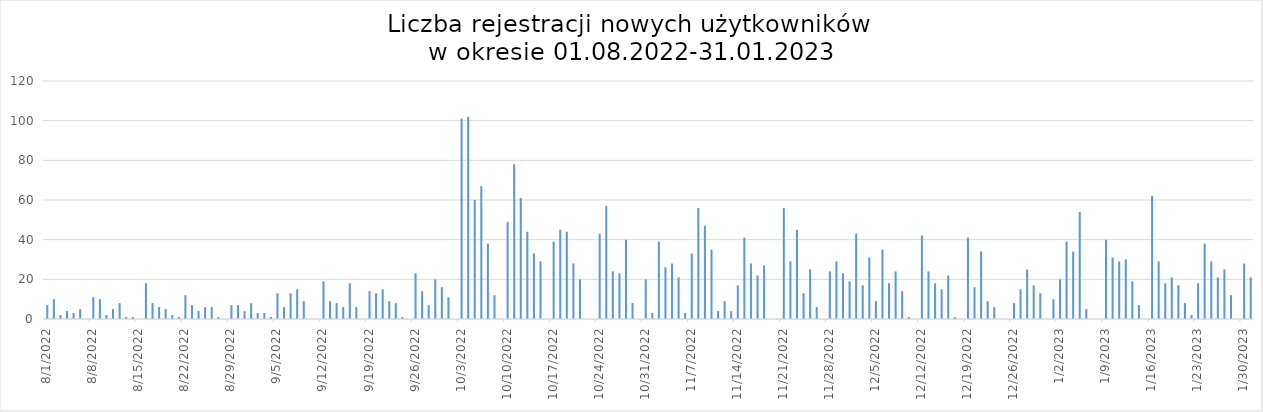
| Category | Dzienna liczba rejestracji |
|---|---|
| 8/1/22 | 7 |
| 8/2/22 | 10 |
| 8/3/22 | 2 |
| 8/4/22 | 4 |
| 8/5/22 | 3 |
| 8/6/22 | 5 |
| 8/8/22 | 11 |
| 8/9/22 | 10 |
| 8/10/22 | 2 |
| 8/11/22 | 5 |
| 8/12/22 | 8 |
| 8/13/22 | 1 |
| 8/14/22 | 1 |
| 8/16/22 | 18 |
| 8/17/22 | 8 |
| 8/18/22 | 6 |
| 8/19/22 | 5 |
| 8/20/22 | 2 |
| 8/21/22 | 1 |
| 8/22/22 | 12 |
| 8/23/22 | 7 |
| 8/24/22 | 4 |
| 8/25/22 | 6 |
| 8/26/22 | 6 |
| 8/27/22 | 1 |
| 8/29/22 | 7 |
| 8/30/22 | 7 |
| 8/31/22 | 4 |
| 9/1/22 | 8 |
| 9/2/22 | 3 |
| 9/3/22 | 3 |
| 9/4/22 | 1 |
| 9/5/22 | 13 |
| 9/6/22 | 6 |
| 9/7/22 | 13 |
| 9/8/22 | 15 |
| 9/9/22 | 9 |
| 9/12/22 | 19 |
| 9/13/22 | 9 |
| 9/14/22 | 8 |
| 9/15/22 | 6 |
| 9/16/22 | 18 |
| 9/17/22 | 6 |
| 9/19/22 | 14 |
| 9/20/22 | 13 |
| 9/21/22 | 15 |
| 9/22/22 | 9 |
| 9/23/22 | 8 |
| 9/24/22 | 1 |
| 9/26/22 | 23 |
| 9/27/22 | 14 |
| 9/28/22 | 7 |
| 9/29/22 | 20 |
| 9/30/22 | 16 |
| 10/1/22 | 11 |
| 10/3/22 | 101 |
| 10/4/22 | 102 |
| 10/5/22 | 60 |
| 10/6/22 | 67 |
| 10/7/22 | 38 |
| 10/8/22 | 12 |
| 10/10/22 | 49 |
| 10/11/22 | 78 |
| 10/12/22 | 61 |
| 10/13/22 | 44 |
| 10/14/22 | 33 |
| 10/15/22 | 29 |
| 10/17/22 | 39 |
| 10/18/22 | 45 |
| 10/19/22 | 44 |
| 10/20/22 | 28 |
| 10/21/22 | 20 |
| 10/24/22 | 43 |
| 10/25/22 | 57 |
| 10/26/22 | 24 |
| 10/27/22 | 23 |
| 10/28/22 | 40 |
| 10/29/22 | 8 |
| 10/31/22 | 20 |
| 11/1/22 | 3 |
| 11/2/22 | 39 |
| 11/3/22 | 26 |
| 11/4/22 | 28 |
| 11/5/22 | 21 |
| 11/6/22 | 3 |
| 11/7/22 | 33 |
| 11/8/22 | 56 |
| 11/9/22 | 47 |
| 11/10/22 | 35 |
| 11/11/22 | 4 |
| 11/12/22 | 9 |
| 11/13/22 | 4 |
| 11/14/22 | 17 |
| 11/15/22 | 41 |
| 11/16/22 | 28 |
| 11/17/22 | 22 |
| 11/18/22 | 27 |
| 11/21/22 | 56 |
| 11/22/22 | 29 |
| 11/23/22 | 45 |
| 11/24/22 | 13 |
| 11/25/22 | 25 |
| 11/26/22 | 6 |
| 11/28/22 | 24 |
| 11/29/22 | 29 |
| 11/30/22 | 23 |
| 12/1/22 | 19 |
| 12/2/22 | 43 |
| 12/3/22 | 17 |
| 12/4/22 | 31 |
| 12/5/22 | 9 |
| 12/6/22 | 35 |
| 12/7/22 | 18 |
| 12/8/22 | 24 |
| 12/9/22 | 14 |
| 12/10/22 | 1 |
| 12/12/22 | 42 |
| 12/13/22 | 24 |
| 12/14/22 | 18 |
| 12/15/22 | 15 |
| 12/16/22 | 22 |
| 12/17/22 | 1 |
| 12/19/22 | 41 |
| 12/20/22 | 16 |
| 12/21/22 | 34 |
| 12/22/22 | 9 |
| 12/23/22 | 6 |
| 12/26/22 | 8 |
| 12/27/22 | 15 |
| 12/28/22 | 25 |
| 12/29/22 | 17 |
| 12/30/22 | 13 |
| 1/1/23 | 10 |
| 1/2/23 | 20 |
| 1/3/23 | 39 |
| 1/4/23 | 34 |
| 1/5/23 | 54 |
| 1/6/23 | 5 |
| 1/9/23 | 40 |
| 1/10/23 | 31 |
| 1/11/23 | 29 |
| 1/12/23 | 30 |
| 1/13/23 | 19 |
| 1/14/23 | 7 |
| 1/16/23 | 62 |
| 1/17/23 | 29 |
| 1/18/23 | 18 |
| 1/19/23 | 21 |
| 1/20/23 | 17 |
| 1/21/23 | 8 |
| 1/22/23 | 2 |
| 1/23/23 | 18 |
| 1/24/23 | 38 |
| 1/25/23 | 29 |
| 1/26/23 | 21 |
| 1/27/23 | 25 |
| 1/28/23 | 12 |
| 1/30/23 | 28 |
| 1/31/23 | 21 |